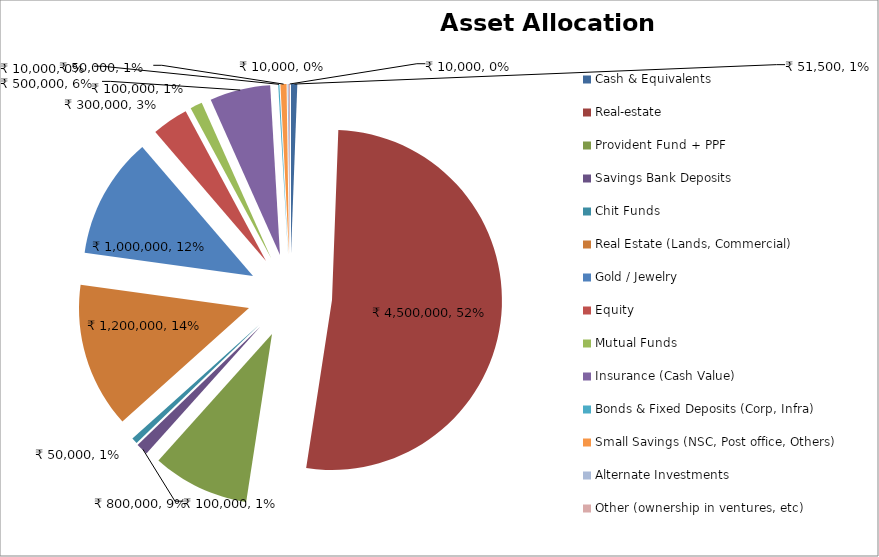
| Category | Series 0 |
|---|---|
| Cash & Equivalents | 51500 |
| Real-estate | 4500000 |
| Provident Fund + PPF | 800000 |
| Savings Bank Deposits  | 100000 |
| Chit Funds | 50000 |
| Real Estate (Lands, Commercial) | 1200000 |
| Gold / Jewelry | 1000000 |
| Equity | 300000 |
| Mutual Funds | 100000 |
| Insurance (Cash Value) | 500000 |
| Bonds & Fixed Deposits (Corp, Infra) | 10000 |
| Small Savings (NSC, Post office, Others) | 50000 |
| Alternate Investments | 10000 |
| Other (ownership in ventures, etc) | 10000 |